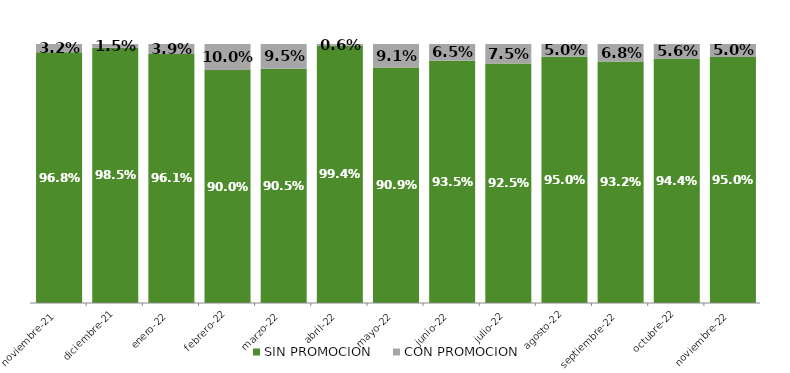
| Category | SIN PROMOCION   | CON PROMOCION   |
|---|---|---|
| 2021-11-01 | 0.968 | 0.032 |
| 2021-12-01 | 0.985 | 0.015 |
| 2022-01-01 | 0.961 | 0.039 |
| 2022-02-01 | 0.9 | 0.1 |
| 2022-03-01 | 0.905 | 0.095 |
| 2022-04-01 | 0.994 | 0.006 |
| 2022-05-01 | 0.909 | 0.091 |
| 2022-06-01 | 0.935 | 0.065 |
| 2022-07-01 | 0.925 | 0.075 |
| 2022-08-01 | 0.95 | 0.05 |
| 2022-09-01 | 0.932 | 0.068 |
| 2022-10-01 | 0.944 | 0.056 |
| 2022-11-01 | 0.95 | 0.05 |